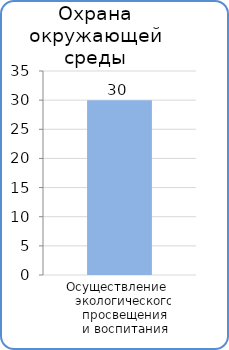
| Category | Расходы |
|---|---|
| Осуществление экологического просвещения и воспитания | 30000 |